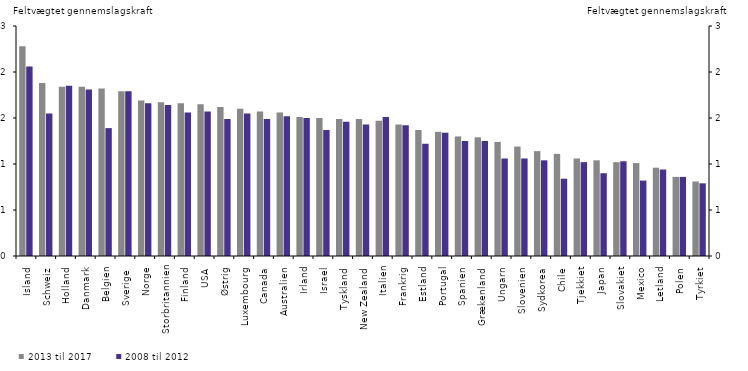
| Category | 2013 til 2017 | 2008 til 2012 |
|---|---|---|
| Island | 2.28 | 2.06 |
| Schweiz | 1.88 | 1.55 |
| Holland | 1.84 | 1.85 |
| Danmark | 1.84 | 1.81 |
| Belgien | 1.82 | 1.39 |
| Sverige  | 1.79 | 1.79 |
| Norge | 1.69 | 1.66 |
| Storbritannien | 1.67 | 1.64 |
| Finland | 1.66 | 1.56 |
| USA | 1.65 | 1.57 |
| Østrig | 1.62 | 1.49 |
| Luxembourg | 1.6 | 1.55 |
| Canada | 1.57 | 1.49 |
| Australien | 1.56 | 1.52 |
| Irland | 1.51 | 1.5 |
| Israel | 1.5 | 1.37 |
| Tyskland | 1.49 | 1.46 |
| New Zealand | 1.49 | 1.43 |
| Italien | 1.47 | 1.51 |
| Frankrig | 1.43 | 1.42 |
| Estland | 1.37 | 1.22 |
| Portugal | 1.35 | 1.34 |
| Spanien | 1.3 | 1.25 |
| Grækenland | 1.29 | 1.25 |
| Ungarn | 1.24 | 1.06 |
| Slovenien | 1.19 | 1.06 |
| Sydkorea | 1.14 | 1.04 |
| Chile | 1.11 | 0.84 |
| Tjekkiet | 1.06 | 1.02 |
| Japan | 1.04 | 0.9 |
| Slovakiet | 1.02 | 1.03 |
| Mexico | 1.01 | 0.82 |
| Letland | 0.96 | 0.94 |
| Polen | 0.86 | 0.86 |
| Tyrkiet | 0.81 | 0.79 |